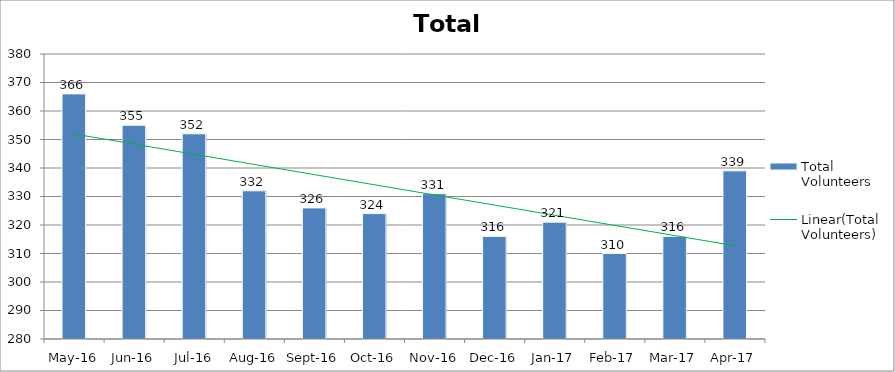
| Category | Total Volunteers |
|---|---|
| May-16 | 366 |
| Jun-16 | 355 |
| Jul-16 | 352 |
| Aug-16 | 332 |
| Sep-16 | 326 |
| Oct-16 | 324 |
| Nov-16 | 331 |
| Dec-16 | 316 |
| Jan-17 | 321 |
| Feb-17 | 310 |
| Mar-17 | 316 |
| Apr-17 | 339 |